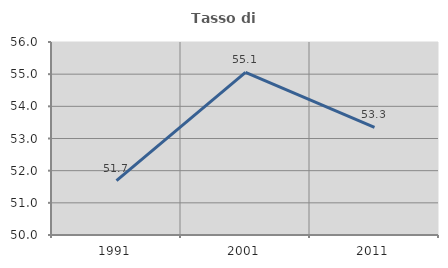
| Category | Tasso di occupazione   |
|---|---|
| 1991.0 | 51.693 |
| 2001.0 | 55.058 |
| 2011.0 | 53.345 |